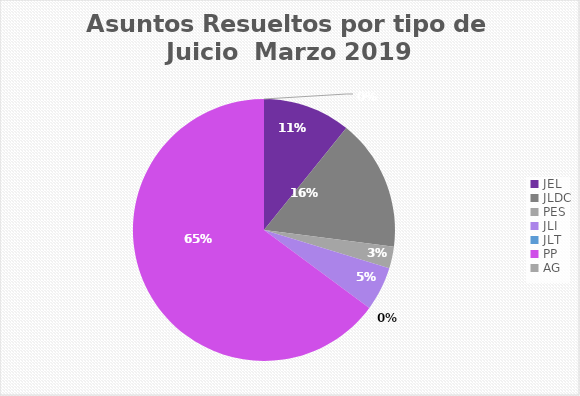
| Category | Asuntos Resueltos por tipo de Juicio  MARZO |
|---|---|
| JEL | 4 |
| JLDC | 6 |
| PES | 1 |
| JLI | 2 |
| JLT | 0 |
| PP | 24 |
| AG | 0 |